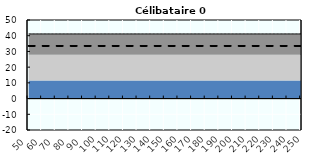
| Category | Coin fiscal moyen (somme des composantes) | Taux moyen d'imposition net en % du salaire brut |
|---|---|---|
| 50.0 | 41.15 | 33.5 |
| 51.0 | 41.15 | 33.5 |
| 52.0 | 41.15 | 33.5 |
| 53.0 | 41.15 | 33.5 |
| 54.0 | 41.15 | 33.5 |
| 55.0 | 41.15 | 33.5 |
| 56.0 | 41.15 | 33.5 |
| 57.0 | 41.15 | 33.5 |
| 58.0 | 41.15 | 33.5 |
| 59.0 | 41.15 | 33.5 |
| 60.0 | 41.15 | 33.5 |
| 61.0 | 41.15 | 33.5 |
| 62.0 | 41.15 | 33.5 |
| 63.0 | 41.15 | 33.5 |
| 64.0 | 41.15 | 33.5 |
| 65.0 | 41.15 | 33.5 |
| 66.0 | 41.15 | 33.5 |
| 67.0 | 41.15 | 33.5 |
| 68.0 | 41.15 | 33.5 |
| 69.0 | 41.15 | 33.5 |
| 70.0 | 41.15 | 33.5 |
| 71.0 | 41.15 | 33.5 |
| 72.0 | 41.15 | 33.5 |
| 73.0 | 41.15 | 33.5 |
| 74.0 | 41.15 | 33.5 |
| 75.0 | 41.15 | 33.5 |
| 76.0 | 41.15 | 33.5 |
| 77.0 | 41.15 | 33.5 |
| 78.0 | 41.15 | 33.5 |
| 79.0 | 41.15 | 33.5 |
| 80.0 | 41.15 | 33.5 |
| 81.0 | 41.15 | 33.5 |
| 82.0 | 41.15 | 33.5 |
| 83.0 | 41.15 | 33.5 |
| 84.0 | 41.15 | 33.5 |
| 85.0 | 41.15 | 33.5 |
| 86.0 | 41.15 | 33.5 |
| 87.0 | 41.15 | 33.5 |
| 88.0 | 41.15 | 33.5 |
| 89.0 | 41.15 | 33.5 |
| 90.0 | 41.15 | 33.5 |
| 91.0 | 41.15 | 33.5 |
| 92.0 | 41.15 | 33.5 |
| 93.0 | 41.15 | 33.5 |
| 94.0 | 41.15 | 33.5 |
| 95.0 | 41.15 | 33.5 |
| 96.0 | 41.15 | 33.5 |
| 97.0 | 41.15 | 33.5 |
| 98.0 | 41.15 | 33.5 |
| 99.0 | 41.15 | 33.5 |
| 100.0 | 41.15 | 33.5 |
| 101.0 | 41.15 | 33.5 |
| 102.0 | 41.15 | 33.5 |
| 103.0 | 41.15 | 33.5 |
| 104.0 | 41.15 | 33.5 |
| 105.0 | 41.15 | 33.5 |
| 106.0 | 41.15 | 33.5 |
| 107.0 | 41.15 | 33.5 |
| 108.0 | 41.15 | 33.5 |
| 109.0 | 41.15 | 33.5 |
| 110.0 | 41.15 | 33.5 |
| 111.0 | 41.15 | 33.5 |
| 112.0 | 41.15 | 33.5 |
| 113.0 | 41.15 | 33.5 |
| 114.0 | 41.15 | 33.5 |
| 115.0 | 41.15 | 33.5 |
| 116.0 | 41.15 | 33.5 |
| 117.0 | 41.15 | 33.5 |
| 118.0 | 41.15 | 33.5 |
| 119.0 | 41.15 | 33.5 |
| 120.0 | 41.15 | 33.5 |
| 121.0 | 41.15 | 33.5 |
| 122.0 | 41.15 | 33.5 |
| 123.0 | 41.15 | 33.5 |
| 124.0 | 41.15 | 33.5 |
| 125.0 | 41.15 | 33.5 |
| 126.0 | 41.15 | 33.5 |
| 127.0 | 41.15 | 33.5 |
| 128.0 | 41.15 | 33.5 |
| 129.0 | 41.15 | 33.5 |
| 130.0 | 41.15 | 33.5 |
| 131.0 | 41.15 | 33.5 |
| 132.0 | 41.15 | 33.5 |
| 133.0 | 41.15 | 33.5 |
| 134.0 | 41.15 | 33.5 |
| 135.0 | 41.15 | 33.5 |
| 136.0 | 41.15 | 33.5 |
| 137.0 | 41.15 | 33.5 |
| 138.0 | 41.15 | 33.5 |
| 139.0 | 41.15 | 33.5 |
| 140.0 | 41.15 | 33.5 |
| 141.0 | 41.15 | 33.5 |
| 142.0 | 41.15 | 33.5 |
| 143.0 | 41.15 | 33.5 |
| 144.0 | 41.15 | 33.5 |
| 145.0 | 41.15 | 33.5 |
| 146.0 | 41.15 | 33.5 |
| 147.0 | 41.15 | 33.5 |
| 148.0 | 41.15 | 33.5 |
| 149.0 | 41.15 | 33.5 |
| 150.0 | 41.15 | 33.5 |
| 151.0 | 41.15 | 33.5 |
| 152.0 | 41.15 | 33.5 |
| 153.0 | 41.15 | 33.5 |
| 154.0 | 41.15 | 33.5 |
| 155.0 | 41.15 | 33.5 |
| 156.0 | 41.15 | 33.5 |
| 157.0 | 41.15 | 33.5 |
| 158.0 | 41.15 | 33.5 |
| 159.0 | 41.15 | 33.5 |
| 160.0 | 41.15 | 33.5 |
| 161.0 | 41.15 | 33.5 |
| 162.0 | 41.15 | 33.5 |
| 163.0 | 41.15 | 33.5 |
| 164.0 | 41.15 | 33.5 |
| 165.0 | 41.15 | 33.5 |
| 166.0 | 41.15 | 33.5 |
| 167.0 | 41.15 | 33.5 |
| 168.0 | 41.15 | 33.5 |
| 169.0 | 41.15 | 33.5 |
| 170.0 | 41.15 | 33.5 |
| 171.0 | 41.15 | 33.5 |
| 172.0 | 41.15 | 33.5 |
| 173.0 | 41.15 | 33.5 |
| 174.0 | 41.15 | 33.5 |
| 175.0 | 41.15 | 33.5 |
| 176.0 | 41.15 | 33.5 |
| 177.0 | 41.15 | 33.5 |
| 178.0 | 41.15 | 33.5 |
| 179.0 | 41.15 | 33.5 |
| 180.0 | 41.15 | 33.5 |
| 181.0 | 41.15 | 33.5 |
| 182.0 | 41.15 | 33.5 |
| 183.0 | 41.15 | 33.5 |
| 184.0 | 41.15 | 33.5 |
| 185.0 | 41.15 | 33.5 |
| 186.0 | 41.15 | 33.5 |
| 187.0 | 41.15 | 33.5 |
| 188.0 | 41.15 | 33.5 |
| 189.0 | 41.15 | 33.5 |
| 190.0 | 41.15 | 33.5 |
| 191.0 | 41.15 | 33.5 |
| 192.0 | 41.15 | 33.5 |
| 193.0 | 41.15 | 33.5 |
| 194.0 | 41.15 | 33.5 |
| 195.0 | 41.15 | 33.5 |
| 196.0 | 41.15 | 33.5 |
| 197.0 | 41.15 | 33.5 |
| 198.0 | 41.15 | 33.5 |
| 199.0 | 41.15 | 33.5 |
| 200.0 | 41.15 | 33.5 |
| 201.0 | 41.15 | 33.5 |
| 202.0 | 41.15 | 33.5 |
| 203.0 | 41.15 | 33.5 |
| 204.0 | 41.15 | 33.5 |
| 205.0 | 41.15 | 33.5 |
| 206.0 | 41.15 | 33.5 |
| 207.0 | 41.15 | 33.5 |
| 208.0 | 41.15 | 33.5 |
| 209.0 | 41.15 | 33.5 |
| 210.0 | 41.15 | 33.5 |
| 211.0 | 41.15 | 33.5 |
| 212.0 | 41.15 | 33.5 |
| 213.0 | 41.15 | 33.5 |
| 214.0 | 41.15 | 33.5 |
| 215.0 | 41.15 | 33.5 |
| 216.0 | 41.15 | 33.5 |
| 217.0 | 41.15 | 33.5 |
| 218.0 | 41.15 | 33.5 |
| 219.0 | 41.15 | 33.5 |
| 220.0 | 41.15 | 33.5 |
| 221.0 | 41.15 | 33.5 |
| 222.0 | 41.15 | 33.5 |
| 223.0 | 41.15 | 33.5 |
| 224.0 | 41.15 | 33.5 |
| 225.0 | 41.15 | 33.5 |
| 226.0 | 41.15 | 33.5 |
| 227.0 | 41.15 | 33.5 |
| 228.0 | 41.15 | 33.5 |
| 229.0 | 41.15 | 33.5 |
| 230.0 | 41.15 | 33.5 |
| 231.0 | 41.15 | 33.5 |
| 232.0 | 41.15 | 33.5 |
| 233.0 | 41.15 | 33.5 |
| 234.0 | 41.15 | 33.5 |
| 235.0 | 41.15 | 33.5 |
| 236.0 | 41.15 | 33.5 |
| 237.0 | 41.15 | 33.5 |
| 238.0 | 41.15 | 33.5 |
| 239.0 | 41.15 | 33.5 |
| 240.0 | 41.15 | 33.5 |
| 241.0 | 41.15 | 33.5 |
| 242.0 | 41.15 | 33.5 |
| 243.0 | 41.15 | 33.5 |
| 244.0 | 41.15 | 33.5 |
| 245.0 | 41.15 | 33.5 |
| 246.0 | 41.15 | 33.5 |
| 247.0 | 41.15 | 33.5 |
| 248.0 | 41.15 | 33.5 |
| 249.0 | 41.15 | 33.5 |
| 250.0 | 41.15 | 33.5 |